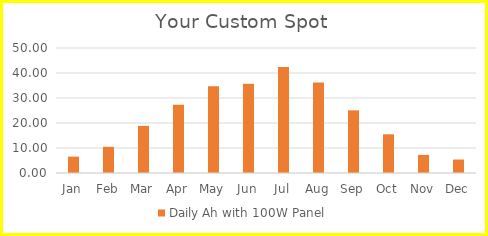
| Category | Daily Ah with 100W Panel |
|---|---|
| Jan | 6.551 |
| Feb | 10.471 |
| Mar | 18.834 |
| Apr | 27.295 |
| May | 34.739 |
| Jun | 35.732 |
| Jul | 42.432 |
| Aug | 36.228 |
| Sep | 25.062 |
| Oct | 15.484 |
| Nov | 7.221 |
| Dec | 5.385 |